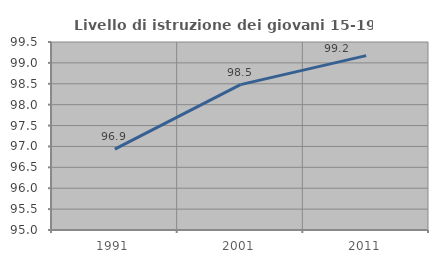
| Category | Livello di istruzione dei giovani 15-19 anni |
|---|---|
| 1991.0 | 96.935 |
| 2001.0 | 98.479 |
| 2011.0 | 99.174 |